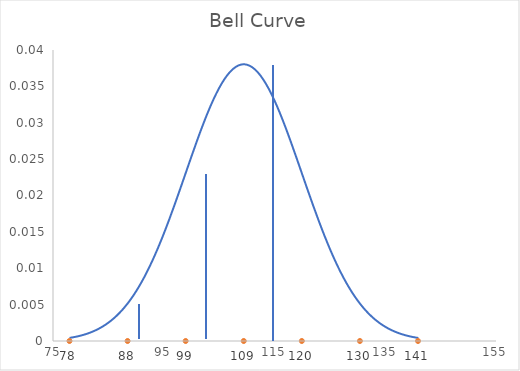
| Category | Normal Dist |
|---|---|
| 77.97664785456192 | 0 |
| 78.97664785456192 | 0.001 |
| 79.97664785456192 | 0.001 |
| 80.97664785456192 | 0.001 |
| 81.97664785456192 | 0.001 |
| 82.97664785456192 | 0.002 |
| 83.97664785456192 | 0.002 |
| 84.97664785456192 | 0.003 |
| 85.97664785456192 | 0.003 |
| 86.97664785456192 | 0.004 |
| 87.97664785456192 | 0.005 |
| 88.97664785456192 | 0.006 |
| 89.97664785456192 | 0.007 |
| 90.97664785456192 | 0.008 |
| 91.97664785456192 | 0.01 |
| 92.97664785456192 | 0.011 |
| 93.97664785456192 | 0.013 |
| 94.97664785456192 | 0.015 |
| 95.97664785456192 | 0.017 |
| 96.97664785456192 | 0.019 |
| 97.97664785456192 | 0.021 |
| 98.97664785456192 | 0.023 |
| 99.97664785456192 | 0.025 |
| 100.97664785456192 | 0.027 |
| 101.97664785456192 | 0.03 |
| 102.97664785456192 | 0.031 |
| 103.97664785456192 | 0.033 |
| 104.97664785456192 | 0.035 |
| 105.97664785456192 | 0.036 |
| 106.97664785456192 | 0.037 |
| 107.97664785456192 | 0.038 |
| 108.97664785456192 | 0.038 |
| 109.97664785456192 | 0.038 |
| 110.97664785456192 | 0.038 |
| 111.97664785456192 | 0.037 |
| 112.97664785456192 | 0.036 |
| 113.97664785456192 | 0.035 |
| 114.97664785456192 | 0.033 |
| 115.97664785456192 | 0.031 |
| 116.97664785456192 | 0.029 |
| 117.97664785456192 | 0.027 |
| 118.97664785456192 | 0.025 |
| 119.97664785456192 | 0.023 |
| 120.97664785456192 | 0.021 |
| 121.97664785456192 | 0.019 |
| 122.97664785456192 | 0.017 |
| 123.97664785456192 | 0.015 |
| 124.97664785456192 | 0.013 |
| 125.97664785456192 | 0.011 |
| 126.97664785456192 | 0.009 |
| 127.97664785456192 | 0.008 |
| 128.97664785456192 | 0.007 |
| 129.97664785456192 | 0.006 |
| 130.97664785456192 | 0.005 |
| 131.97664785456192 | 0.004 |
| 132.97664785456192 | 0.003 |
| 133.97664785456192 | 0.002 |
| 134.97664785456192 | 0.002 |
| 135.97664785456192 | 0.002 |
| 136.97664785456192 | 0.001 |
| 137.97664785456192 | 0.001 |
| 138.97664785456192 | 0.001 |
| 139.97664785456192 | 0.001 |
| 140.97664785456192 | 0 |